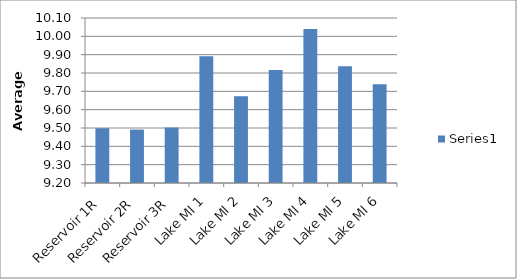
| Category | Series 0 |
|---|---|
| Reservoir 1R | 9.499 |
| Reservoir 2R | 9.491 |
| Reservoir 3R | 9.502 |
| Lake MI 1 | 9.891 |
| Lake MI 2 | 9.673 |
| Lake MI 3 | 9.816 |
| Lake MI 4 | 10.04 |
| Lake MI 5 | 9.837 |
| Lake MI 6 | 9.738 |